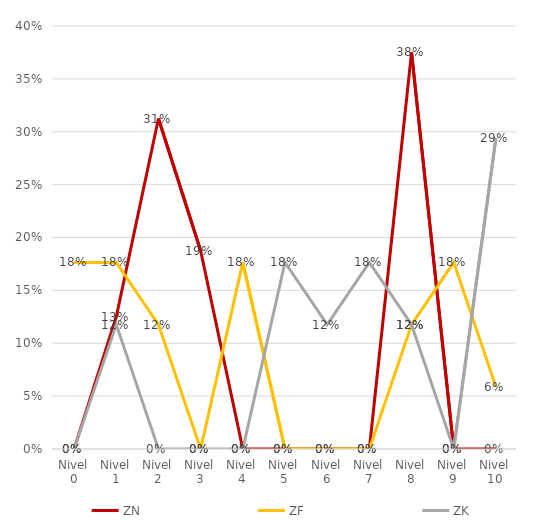
| Category | ZN | ZF | ZK |
|---|---|---|---|
| Nivel 0 | 0 | 0.176 | 0 |
| Nivel 1 | 0.125 | 0.176 | 0.118 |
| Nivel 2 | 0.312 | 0.118 | 0 |
| Nivel 3 | 0.188 | 0 | 0 |
| Nivel 4 | 0 | 0.176 | 0 |
| Nivel 5 | 0 | 0 | 0.176 |
| Nivel 6 | 0 | 0 | 0.118 |
| Nivel 7 | 0 | 0 | 0.176 |
| Nivel 8 | 0.375 | 0.118 | 0.118 |
| Nivel 9 | 0 | 0.176 | 0 |
| Nivel 10 | 0 | 0.059 | 0.294 |